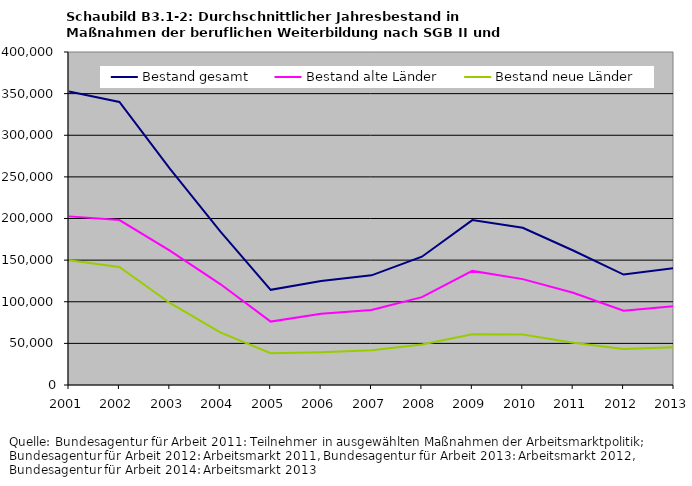
| Category | Bestand gesamt | Bestand alte Länder | Bestand neue Länder |
|---|---|---|---|
| 2001 | 352443.208 | 202552.208 | 149891 |
| 2002 | 339917.875 | 198080 | 141837.875 |
| 2003 | 259922.25 | 161404.375 | 98517.875 |
| 2004 | 184417.583 | 121239.292 | 63178.292 |
| 2005 | 114350.083 | 76157.083 | 38193 |
| 2006 | 124799.667 | 85535.417 | 39264.25 |
| 2007 | 131713.583 | 90055.667 | 41657.917 |
| 2008 | 154087.667 | 105508.25 | 48579.417 |
| 2009 | 198103.5 | 137049.417 | 61054.083 |
| 2010 | 188782 | 127177 | 60605 |
| 2011 | 161575 | 110825 | 50751 |
| 2012 | 132654 | 89340 | 43314 |
| 2013 | 140311 | 94782 | 45529 |